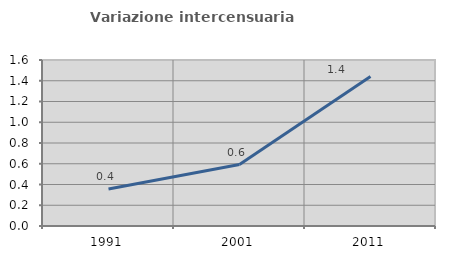
| Category | Variazione intercensuaria annua |
|---|---|
| 1991.0 | 0.357 |
| 2001.0 | 0.592 |
| 2011.0 | 1.441 |